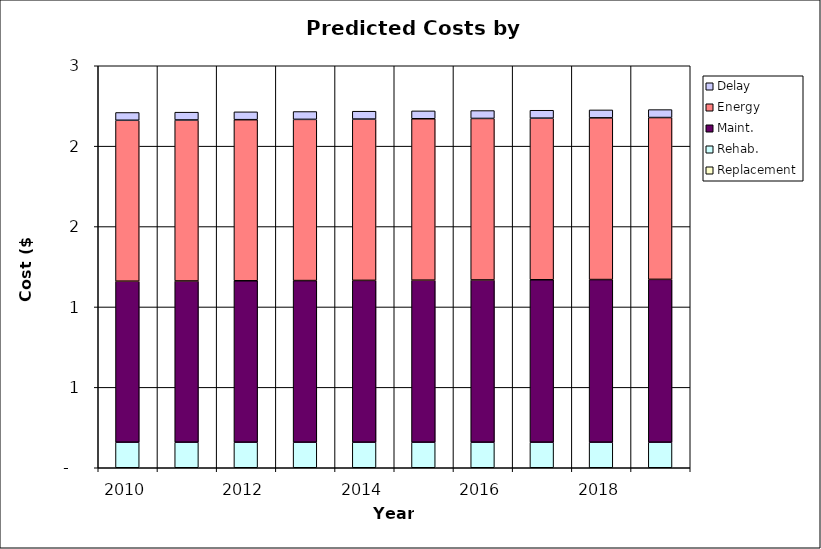
| Category | Replacement | Rehab. | Maint. | Energy | Delay |
|---|---|---|---|---|---|
| 2010.0 | 0 | 0.159 | 1.001 | 1.001 | 0.048 |
| 2011.0 | 0 | 0.159 | 1.003 | 1.001 | 0.049 |
| 2012.0 | 0 | 0.159 | 1.004 | 1.002 | 0.049 |
| 2013.0 | 0 | 0.159 | 1.005 | 1.003 | 0.049 |
| 2014.0 | 0 | 0.159 | 1.006 | 1.003 | 0.049 |
| 2015.0 | 0 | 0.159 | 1.008 | 1.004 | 0.049 |
| 2016.0 | 0 | 0.159 | 1.009 | 1.004 | 0.049 |
| 2017.0 | 0 | 0.159 | 1.01 | 1.005 | 0.049 |
| 2018.0 | 0 | 0.159 | 1.011 | 1.006 | 0.049 |
| 2019.0 | 0 | 0.159 | 1.013 | 1.006 | 0.049 |